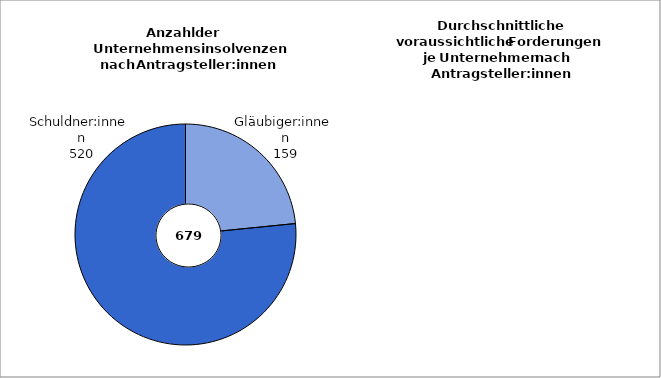
| Category | Series 0 |
|---|---|
| Gläubiger:innen | 159 |
| Schuldner:innen | 520 |